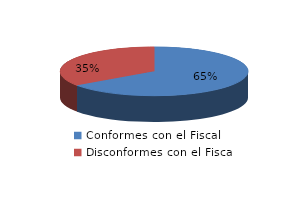
| Category | Series 0 |
|---|---|
| 0 | 45 |
| 1 | 24 |